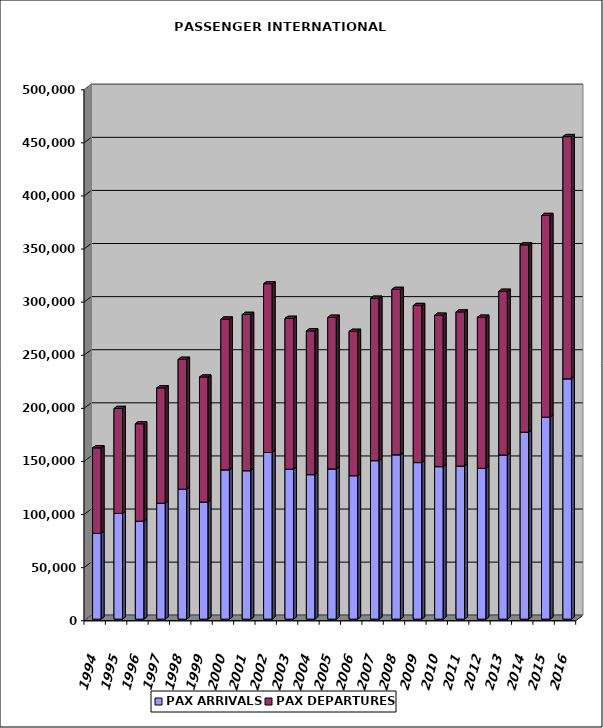
| Category | PAX ARRIVALS | PAX DEPARTURES |
|---|---|---|
| 1994.0 | 80734 | 80495 |
| 1995.0 | 99550 | 98750 |
| 1996.0 | 92225 | 91708 |
| 1997.0 | 109088 | 108686 |
| 1998.0 | 122303 | 122258 |
| 1999.0 | 110199 | 117733 |
| 2000.0 | 140592 | 141890 |
| 2001.0 | 139773 | 147084 |
| 2002.0 | 156879 | 158912 |
| 2003.0 | 141254 | 141908 |
| 2004.0 | 136061 | 135301 |
| 2005.0 | 141440 | 142712 |
| 2006.0 | 135083 | 135818 |
| 2007.0 | 149231 | 152857 |
| 2008.0 | 154765 | 155639 |
| 2009.0 | 147402 | 147831 |
| 2010.0 | 143597 | 142508 |
| 2011.0 | 144058 | 145207 |
| 2012.0 | 142027 | 142179 |
| 2013.0 | 154489 | 154118 |
| 2014.0 | 175986 | 176398 |
| 2015.0 | 190129 | 189882 |
| 2016.0 | 226308 | 227992 |